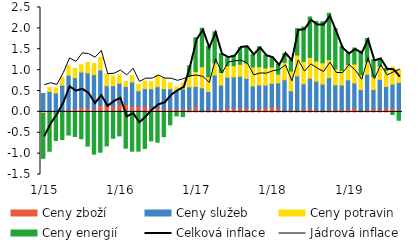
| Category | Ceny zboží | Ceny služeb | Ceny potravin | Ceny energií |
|---|---|---|---|---|
|  1/15 | -0.019 | 0.44 | -0.016 | -1.079 |
| 2 | -0.027 | 0.486 | 0.095 | -0.917 |
| 3 | -0.003 | 0.452 | 0.122 | -0.684 |
| 4 | 0.037 | 0.603 | 0.186 | -0.662 |
| 5 | 0.058 | 0.82 | 0.226 | -0.555 |
| 6 | 0.079 | 0.741 | 0.224 | -0.591 |
| 7 | 0.111 | 0.842 | 0.176 | -0.644 |
| 8 | 0.098 | 0.837 | 0.249 | -0.819 |
| 9 | 0.074 | 0.82 | 0.263 | -1.012 |
| 10 | 0.155 | 0.847 | 0.303 | -0.966 |
| 11 | 0.147 | 0.478 | 0.287 | -0.813 |
| 12 | 0.126 | 0.501 | 0.234 | -0.632 |
|  1/16 | 0.19 | 0.495 | 0.2 | -0.574 |
| 2 | 0.183 | 0.426 | 0.117 | -0.869 |
| 3 | 0.134 | 0.582 | 0.153 | -0.942 |
| 4 | 0.139 | 0.363 | 0.155 | -0.941 |
| 5 | 0.144 | 0.414 | 0.178 | -0.876 |
| 6 | 0.104 | 0.449 | 0.17 | -0.696 |
| 7 | 0.095 | 0.508 | 0.269 | -0.726 |
| 8 | 0.084 | 0.473 | 0.245 | -0.593 |
| 9 | 0.071 | 0.485 | 0.137 | -0.311 |
| 10 | 0.068 | 0.45 | 0.076 | -0.095 |
| 11 | 0.076 | 0.474 | 0.138 | -0.112 |
| 12 | 0.079 | 0.521 | 0.246 | 0.26 |
|  1/17 | 0.128 | 0.48 | 0.357 | 0.811 |
| 2 | 0.04 | 0.537 | 0.504 | 0.922 |
| 3 | 0.06 | 0.426 | 0.354 | 0.727 |
| 4 | 0.058 | 0.824 | 0.292 | 0.745 |
| 5 | 0.063 | 0.579 | 0.301 | 0.454 |
| 6 | 0.089 | 0.742 | 0.273 | 0.189 |
| 7 | 0.1 | 0.737 | 0.271 | 0.222 |
| 8 | 0.097 | 0.758 | 0.286 | 0.396 |
| 9 | 0.102 | 0.703 | 0.365 | 0.396 |
| 10 | 0.062 | 0.555 | 0.46 | 0.304 |
| 11 | 0.086 | 0.557 | 0.438 | 0.479 |
| 12 | 0.101 | 0.537 | 0.414 | 0.304 |
|  1/18 | 0.126 | 0.559 | 0.39 | 0.238 |
| 2 | 0.107 | 0.587 | 0.211 | 0.229 |
| 3 | 0.034 | 0.736 | 0.415 | 0.215 |
| 4 | 0.054 | 0.451 | 0.474 | 0.269 |
| 5 | 0.044 | 0.818 | 0.499 | 0.633 |
| 6 | 0.067 | 0.604 | 0.537 | 0.822 |
| 7 | 0.088 | 0.718 | 0.497 | 0.97 |
| 8 | 0.054 | 0.682 | 0.48 | 0.949 |
| 9 | 0.041 | 0.624 | 0.511 | 0.983 |
| 10 | 0.064 | 0.756 | 0.428 | 1.113 |
| 11 | 0.057 | 0.591 | 0.385 | 0.959 |
| 12 | 0.062 | 0.581 | 0.349 | 0.573 |
|  1/19 | 0.083 | 0.684 | 0.366 | 0.287 |
| 2 | 0.093 | 0.598 | 0.456 | 0.382 |
| 3 | 0.036 | 0.498 | 0.353 | 0.562 |
| 4 | 0.059 | 0.841 | 0.301 | 0.555 |
| 5 | 0.081 | 0.455 | 0.303 | 0.412 |
| 6 | 0.068 | 0.71 | 0.317 | 0.184 |
| 7 | 0.091 | 0.519 | 0.381 | 0.05 |
| 8 | 0.086 | 0.576 | 0.412 | -0.064 |
| 9 | 0.06 | 0.645 | 0.309 | -0.201 |